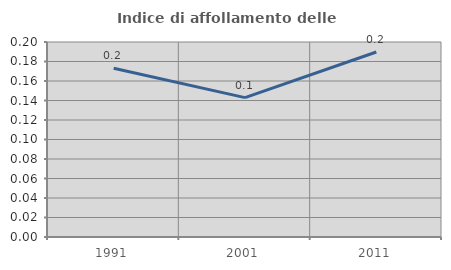
| Category | Indice di affollamento delle abitazioni  |
|---|---|
| 1991.0 | 0.173 |
| 2001.0 | 0.143 |
| 2011.0 | 0.19 |